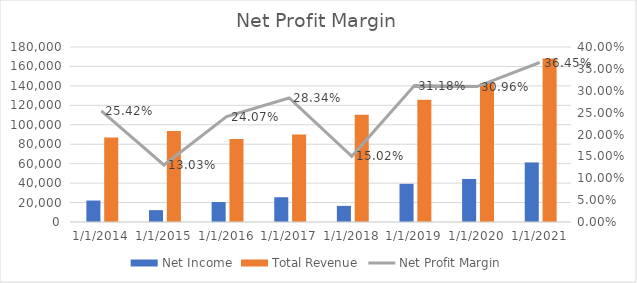
| Category | Net Income | Total Revenue |
|---|---|---|
| 12/31/14 | 22074 | 86830 |
| 12/31/15 | 12193 | 93580 |
| 12/31/16 | 20539 | 85320 |
| 12/31/17 | 25489 | 89950 |
| 12/31/18 | 16571 | 110360 |
| 12/31/19 | 39240 | 125843 |
| 12/31/20 | 44281 | 143015 |
| 12/31/21 | 61271 | 168088 |